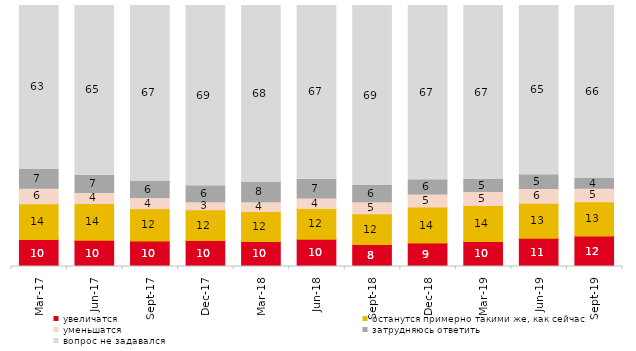
| Category | увеличатся | останутся примерно такими же, как сейчас | уменьшатся | затрудняюсь ответить | вопрос не задавался |
|---|---|---|---|---|---|
| 2017-03-01 | 10.3 | 13.75 | 5.95 | 7.2 | 62.8 |
| 2017-06-01 | 10.05 | 14.05 | 4.3 | 6.55 | 65.05 |
| 2017-09-01 | 9.8 | 12.3 | 4.3 | 6.4 | 67.2 |
| 2017-12-01 | 9.95 | 11.75 | 3.1 | 6.15 | 69.05 |
| 2018-03-01 | 9.6 | 11.5 | 3.75 | 7.5 | 67.65 |
| 2018-06-01 | 10.45 | 11.75 | 4.05 | 7.2 | 66.55 |
| 2018-09-01 | 8.45 | 11.8 | 4.6 | 6.15 | 69 |
| 2018-12-01 | 9.05 | 13.7 | 5 | 5.5 | 66.75 |
| 2019-03-01 | 9.597 | 13.774 | 5.321 | 4.625 | 66.683 |
| 2019-06-01 | 10.823 | 13.367 | 5.736 | 5.237 | 64.838 |
| 2019-09-01 | 11.683 | 13.119 | 5.198 | 3.713 | 66.287 |